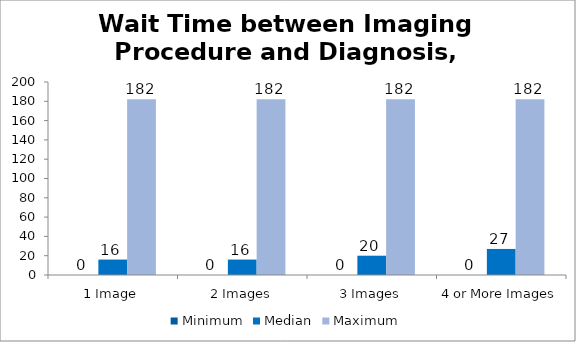
| Category | Minimum | Median | Maximum |
|---|---|---|---|
| 1 Image | 0 | 16 | 182 |
| 2 Images | 0 | 16 | 182 |
| 3 Images | 0 | 20 | 182 |
| 4 or More Images | 0 | 27 | 182 |